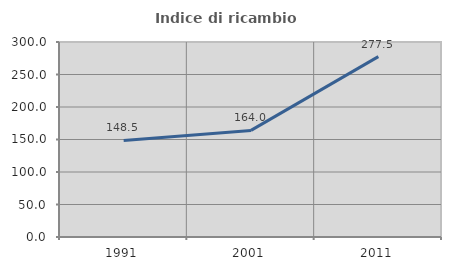
| Category | Indice di ricambio occupazionale  |
|---|---|
| 1991.0 | 148.485 |
| 2001.0 | 164.027 |
| 2011.0 | 277.469 |